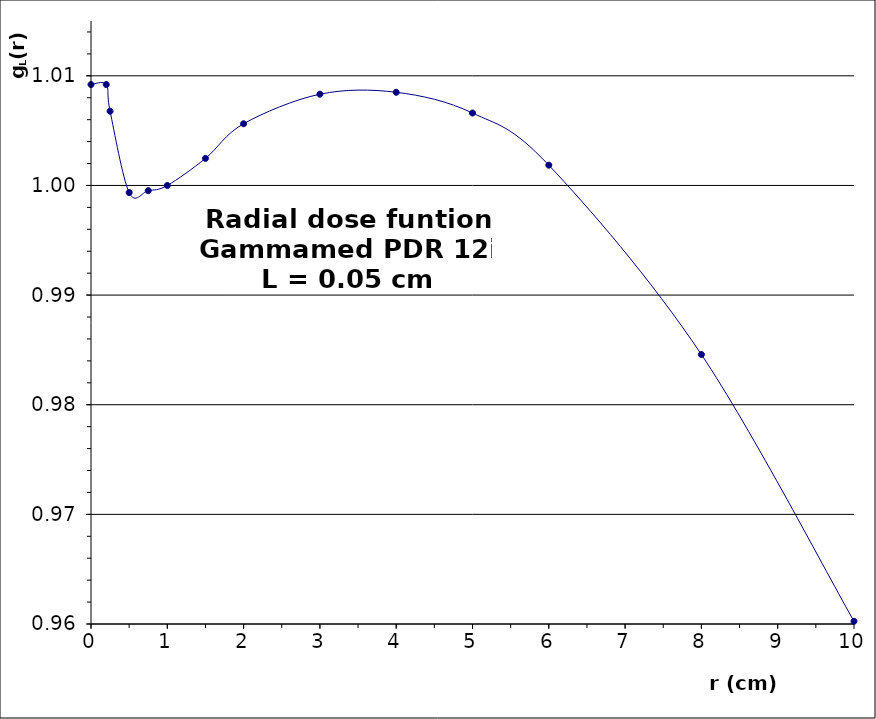
| Category | Series 0 |
|---|---|
| 0.0 | 1.009 |
| 0.2 | 1.009 |
| 0.25 | 1.007 |
| 0.5 | 0.999 |
| 0.75 | 1 |
| 1.0 | 1 |
| 1.5 | 1.002 |
| 2.0 | 1.006 |
| 3.0 | 1.008 |
| 4.0 | 1.008 |
| 5.0 | 1.007 |
| 6.0 | 1.002 |
| 8.0 | 0.985 |
| 10.0 | 0.96 |